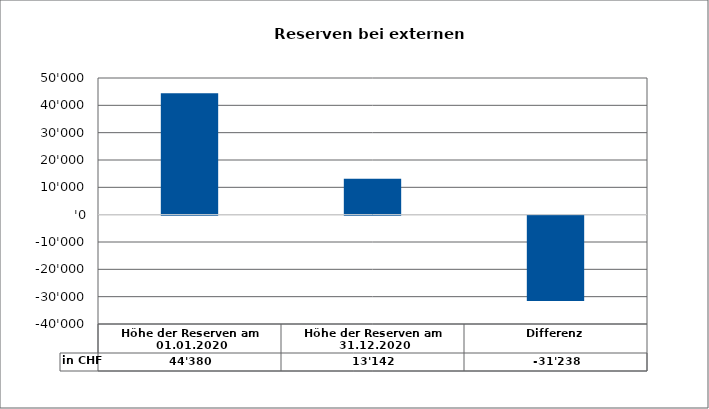
| Category | in CHF |
|---|---|
| Höhe der Reserven am 01.01.2020 | 44380 |
| Höhe der Reserven am 31.12.2020 | 13142 |
| Differenz | -31238 |